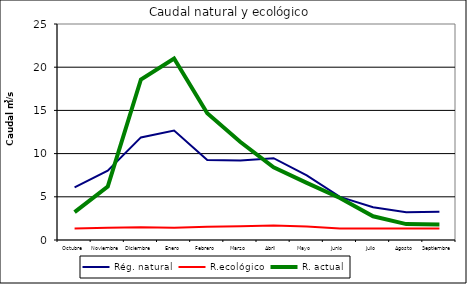
| Category | Rég. natural | R.ecológico | R. actual |
|---|---|---|---|
| Octubre | 6.093 | 1.321 | 3.225 |
| Noviembre | 8.014 | 1.422 | 6.194 |
| Diciembre | 11.873 | 1.487 | 18.576 |
| Enero | 12.663 | 1.406 | 21.004 |
| Febrero | 9.256 | 1.529 | 14.677 |
| Marzo | 9.192 | 1.578 | 11.337 |
| Abril | 9.47 | 1.666 | 8.403 |
| Mayo | 7.484 | 1.558 | 6.607 |
| Junio | 4.996 | 1.329 | 4.868 |
| Julio | 3.797 | 1.321 | 2.746 |
| Agosto | 3.223 | 1.321 | 1.843 |
| Septiembre | 3.282 | 1.321 | 1.805 |